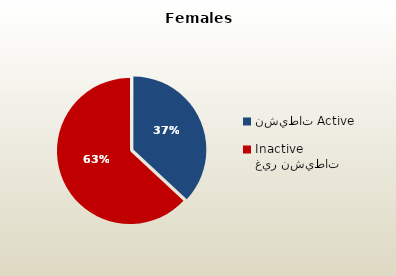
| Category | الاناث القطريات  Qatari Females |
|---|---|
| نشيطات Active | 39501 |
| غير نشيطات Inactive | 67488 |